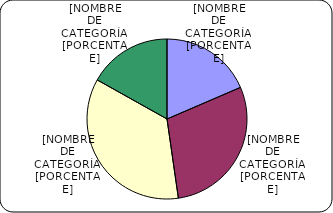
| Category | Series 0 |
|---|---|
| Entre 1-5 años | 2471.2 |
| Entre 6-10 años | 3892.2 |
| Entre 11-20 años | 4719.5 |
| Mayores de 20 años | 2249.8 |